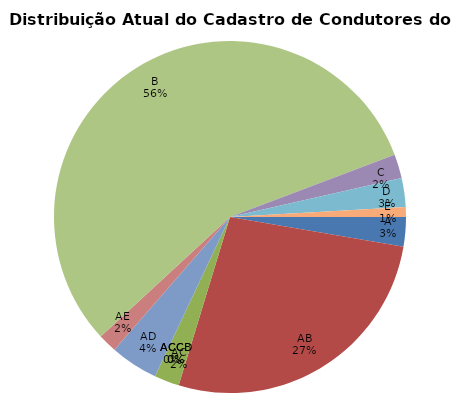
| Category | PERÍODO COMPETÊNCIA |
|---|---|
| A | 141107 |
| AB | 1415906 |
| AC | 120211 |
| ACC | 70 |
| ACCB | 29 |
| ACCD | 1 |
| AD | 230590 |
| AE | 90567 |
| B | 2940678 |
| C | 115409 |
| D | 138331 |
| E | 48002 |